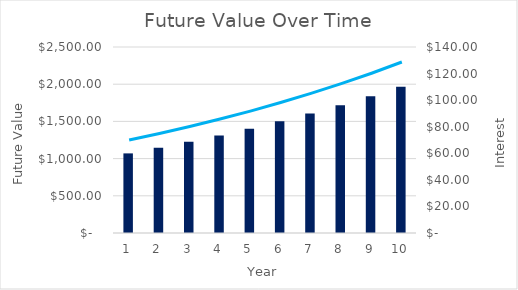
| Category | Future Value |
|---|---|
| 0 | 1070 |
| 1 | 1144.9 |
| 2 | 1225.043 |
| 3 | 1310.796 |
| 4 | 1402.552 |
| 5 | 1500.73 |
| 6 | 1605.781 |
| 7 | 1718.186 |
| 8 | 1838.459 |
| 9 | 1967.151 |